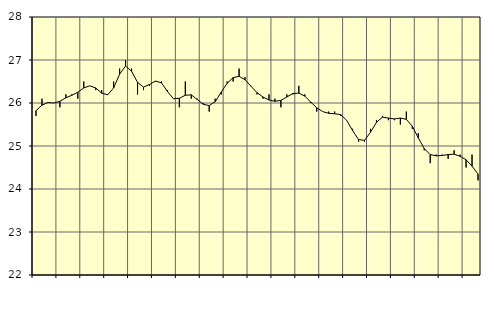
| Category | Piggar | Series 1 |
|---|---|---|
| nan | 25.7 | 25.82 |
| 1.0 | 26.1 | 25.95 |
| 1.0 | 26 | 26.01 |
| 1.0 | 26 | 26 |
| nan | 25.9 | 26.04 |
| 2.0 | 26.2 | 26.12 |
| 2.0 | 26.2 | 26.18 |
| 2.0 | 26.1 | 26.25 |
| nan | 26.5 | 26.35 |
| 3.0 | 26.4 | 26.4 |
| 3.0 | 26.3 | 26.35 |
| 3.0 | 26.3 | 26.23 |
| nan | 26.2 | 26.19 |
| 4.0 | 26.5 | 26.35 |
| 4.0 | 26.8 | 26.67 |
| 4.0 | 27 | 26.86 |
| nan | 26.8 | 26.74 |
| 5.0 | 26.2 | 26.48 |
| 5.0 | 26.3 | 26.37 |
| 5.0 | 26.4 | 26.43 |
| nan | 26.5 | 26.51 |
| 6.0 | 26.5 | 26.47 |
| 6.0 | 26.3 | 26.27 |
| 6.0 | 26.1 | 26.1 |
| nan | 25.9 | 26.11 |
| 7.0 | 26.5 | 26.18 |
| 7.0 | 26.1 | 26.19 |
| 7.0 | 26.1 | 26.08 |
| nan | 26 | 25.97 |
| 8.0 | 25.8 | 25.94 |
| 8.0 | 26.1 | 26.03 |
| 8.0 | 26.2 | 26.25 |
| nan | 26.5 | 26.46 |
| 9.0 | 26.5 | 26.59 |
| 9.0 | 26.8 | 26.62 |
| 9.0 | 26.6 | 26.54 |
| nan | 26.4 | 26.39 |
| 10.0 | 26.2 | 26.24 |
| 10.0 | 26.1 | 26.14 |
| 10.0 | 26.2 | 26.07 |
| nan | 26.1 | 26.04 |
| 11.0 | 25.9 | 26.06 |
| 11.0 | 26.2 | 26.14 |
| 11.0 | 26.2 | 26.22 |
| nan | 26.4 | 26.23 |
| 12.0 | 26.2 | 26.16 |
| 12.0 | 26 | 26.02 |
| 12.0 | 25.8 | 25.89 |
| nan | 25.8 | 25.8 |
| 13.0 | 25.8 | 25.76 |
| 13.0 | 25.8 | 25.75 |
| 13.0 | 25.7 | 25.73 |
| nan | 25.6 | 25.6 |
| 14.0 | 25.4 | 25.36 |
| 14.0 | 25.1 | 25.15 |
| 14.0 | 25.1 | 25.13 |
| nan | 25.4 | 25.32 |
| 15.0 | 25.6 | 25.55 |
| 15.0 | 25.7 | 25.67 |
| 15.0 | 25.6 | 25.65 |
| nan | 25.6 | 25.63 |
| 16.0 | 25.5 | 25.65 |
| 16.0 | 25.8 | 25.62 |
| 16.0 | 25.4 | 25.46 |
| nan | 25.3 | 25.19 |
| 17.0 | 24.9 | 24.94 |
| 17.0 | 24.6 | 24.8 |
| 17.0 | 24.8 | 24.77 |
| nan | 24.8 | 24.78 |
| 18.0 | 24.7 | 24.8 |
| 18.0 | 24.9 | 24.81 |
| 18.0 | 24.8 | 24.76 |
| nan | 24.5 | 24.68 |
| 19.0 | 24.8 | 24.53 |
| 19.0 | 24.2 | 24.35 |